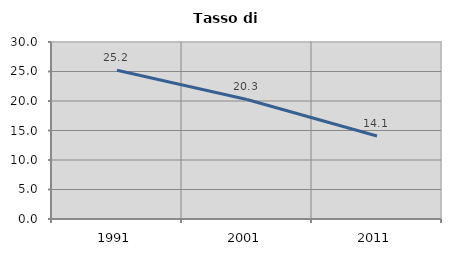
| Category | Tasso di disoccupazione   |
|---|---|
| 1991.0 | 25.214 |
| 2001.0 | 20.26 |
| 2011.0 | 14.078 |